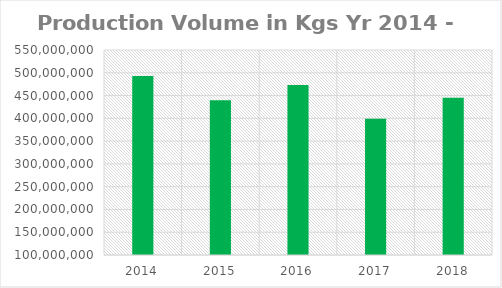
| Category | Volume in Kgs |
|---|---|
| 2014.0 | 492998723 |
| 2015.0 | 439857739 |
| 2016.0 | 473011323 |
| 2017.0 | 399211367 |
| 2018.0 | 445104734 |